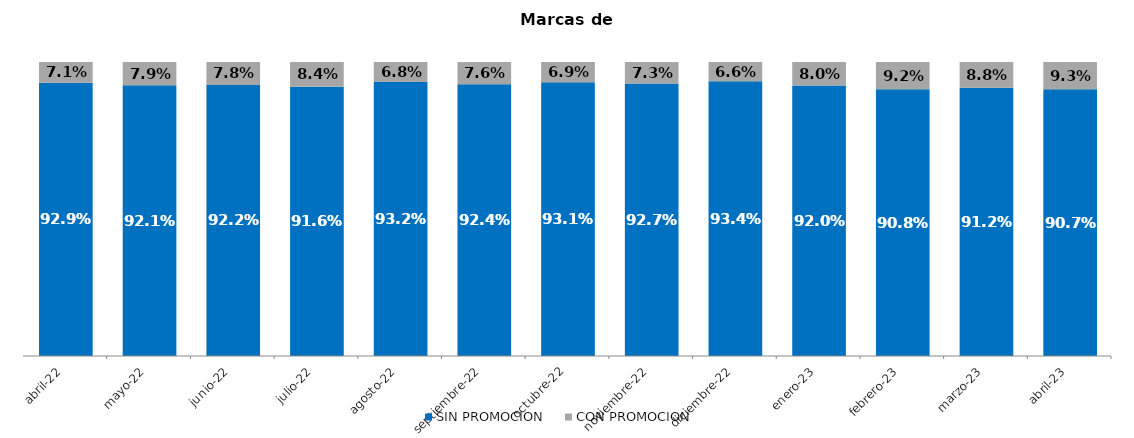
| Category | SIN PROMOCION   | CON PROMOCION   |
|---|---|---|
| 2022-04-01 | 0.929 | 0.071 |
| 2022-05-01 | 0.921 | 0.079 |
| 2022-06-01 | 0.922 | 0.078 |
| 2022-07-01 | 0.916 | 0.084 |
| 2022-08-01 | 0.932 | 0.068 |
| 2022-09-01 | 0.924 | 0.076 |
| 2022-10-01 | 0.931 | 0.069 |
| 2022-11-01 | 0.927 | 0.073 |
| 2022-12-01 | 0.934 | 0.066 |
| 2023-01-01 | 0.92 | 0.08 |
| 2023-02-01 | 0.908 | 0.092 |
| 2023-03-01 | 0.912 | 0.088 |
| 2023-04-01 | 0.907 | 0.093 |